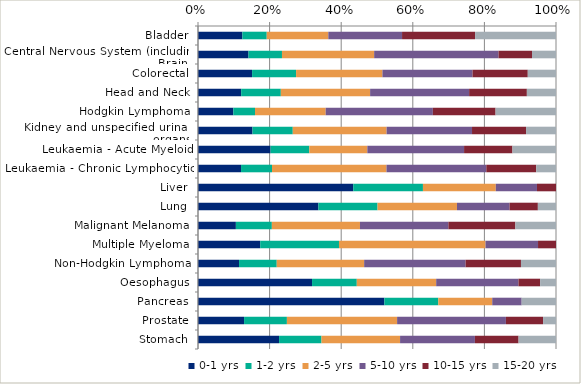
| Category | 0-1 yrs | 1-2 yrs | 2-5 yrs | 5-10 yrs | 10-15 yrs | 15-20 yrs |
|---|---|---|---|---|---|---|
| Bladder | 0.124 | 0.068 | 0.172 | 0.206 | 0.204 | 0.226 |
| Central Nervous System (including Brain) | 0.141 | 0.093 | 0.257 | 0.347 | 0.093 | 0.067 |
| Colorectal | 0.151 | 0.123 | 0.241 | 0.252 | 0.154 | 0.079 |
| Head and Neck | 0.121 | 0.111 | 0.249 | 0.277 | 0.161 | 0.081 |
| Hodgkin Lymphoma | 0.099 | 0.061 | 0.197 | 0.299 | 0.175 | 0.169 |
| Kidney and unspecified urinary organs | 0.152 | 0.112 | 0.262 | 0.239 | 0.151 | 0.084 |
| Leukaemia - Acute Myeloid | 0.203 | 0.108 | 0.162 | 0.27 | 0.135 | 0.122 |
| Leukaemia - Chronic Lymphocytic | 0.12 | 0.087 | 0.32 | 0.279 | 0.139 | 0.055 |
| Liver | 0.434 | 0.195 | 0.204 | 0.115 | 0.053 | 0 |
| Lung | 0.336 | 0.165 | 0.222 | 0.147 | 0.079 | 0.051 |
| Malignant Melanoma | 0.106 | 0.1 | 0.246 | 0.247 | 0.187 | 0.113 |
| Multiple Myeloma | 0.174 | 0.22 | 0.409 | 0.147 | 0.05 | 0 |
| Non-Hodgkin Lymphoma | 0.115 | 0.105 | 0.244 | 0.283 | 0.155 | 0.098 |
| Oesophagus | 0.319 | 0.125 | 0.222 | 0.23 | 0.06 | 0.044 |
| Pancreas | 0.521 | 0.151 | 0.151 | 0.082 | 0 | 0.096 |
| Prostate | 0.129 | 0.12 | 0.308 | 0.304 | 0.104 | 0.036 |
| Stomach | 0.226 | 0.118 | 0.22 | 0.209 | 0.122 | 0.105 |